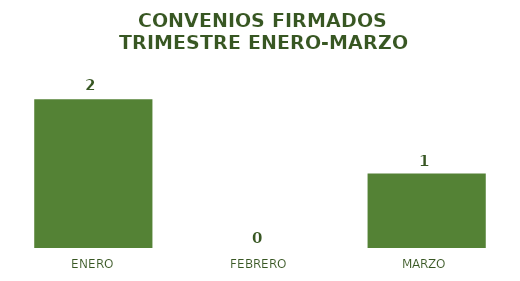
| Category | CANTIDAD |
|---|---|
| ENERO | 2 |
| FEBRERO | 0 |
| MARZO | 1 |